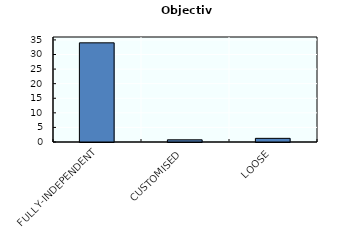
| Category | Objective |
|---|---|
| FULLY-INDEPENDENT | 34 |
| CUSTOMISED | 0.75 |
| LOOSE | 1.25 |